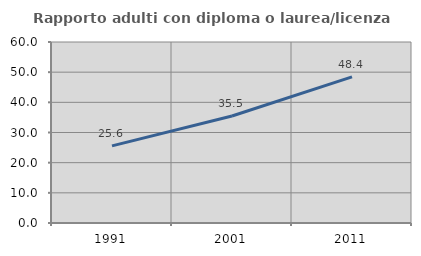
| Category | Rapporto adulti con diploma o laurea/licenza media  |
|---|---|
| 1991.0 | 25.571 |
| 2001.0 | 35.484 |
| 2011.0 | 48.429 |